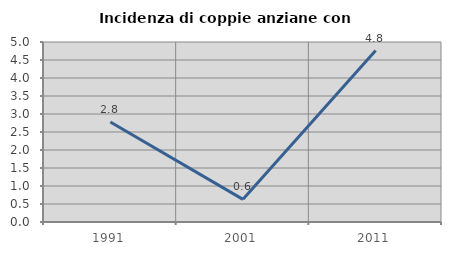
| Category | Incidenza di coppie anziane con figli |
|---|---|
| 1991.0 | 2.778 |
| 2001.0 | 0.629 |
| 2011.0 | 4.762 |